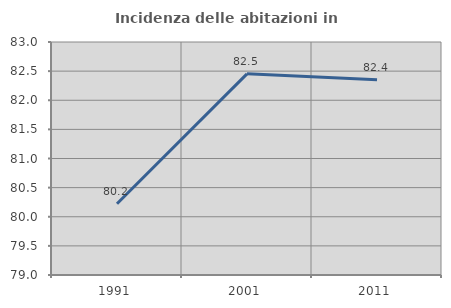
| Category | Incidenza delle abitazioni in proprietà  |
|---|---|
| 1991.0 | 80.224 |
| 2001.0 | 82.454 |
| 2011.0 | 82.351 |